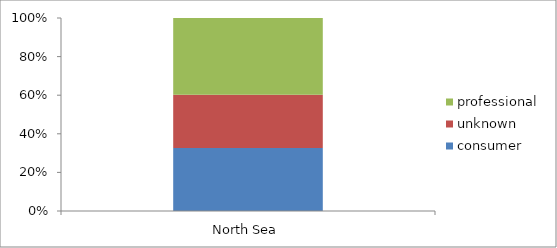
| Category | consumer | unknown | professional |
|---|---|---|---|
| North Sea | 0.326 | 0.277 | 0.397 |